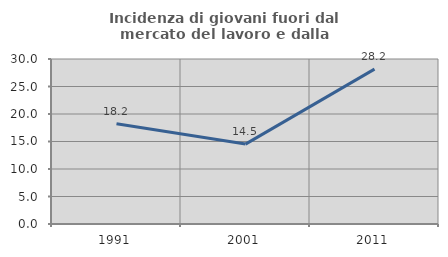
| Category | Incidenza di giovani fuori dal mercato del lavoro e dalla formazione  |
|---|---|
| 1991.0 | 18.23 |
| 2001.0 | 14.528 |
| 2011.0 | 28.16 |